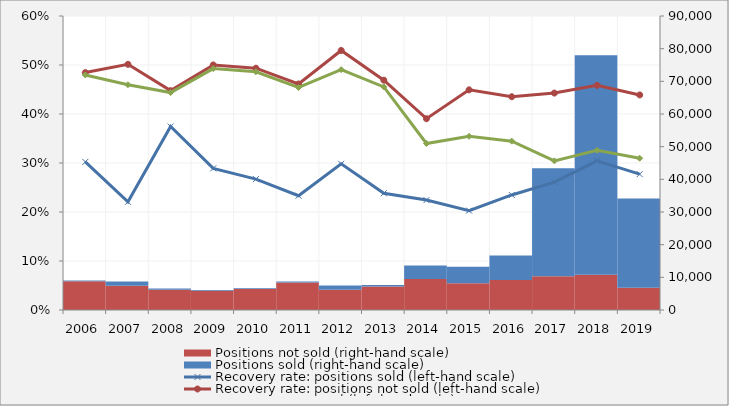
| Category | Positions not sold (right-hand scale) | Positions sold (right-hand scale) |
|---|---|---|
| 2006.0 | 8803040402 | 236068123 |
| 2007.0 | 7442770518 | 1298764521 |
| 2008.0 | 6225493473 | 354965552 |
| 2009.0 | 5892617853 | 216283928 |
| 2010.0 | 6454267206 | 212601734 |
| 2011.0 | 8441794414 | 276187901 |
| 2012.0 | 6206683948 | 1265786059 |
| 2013.0 | 7228959124 | 454084164 |
| 2014.0 | 9462846090 | 4149678117 |
| 2015.0 | 8157372643 | 5100781018 |
| 2016.0 | 9154968848 | 7557258123 |
| 2017.0 | 10348998626 | 33010733708 |
| 2018.0 | 10794203636 | 67222799218 |
| 2019.0 | 6848646257 | 27274696332 |